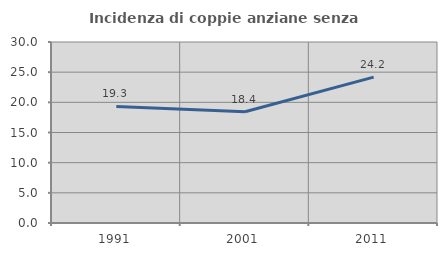
| Category | Incidenza di coppie anziane senza figli  |
|---|---|
| 1991.0 | 19.318 |
| 2001.0 | 18.447 |
| 2011.0 | 24.176 |